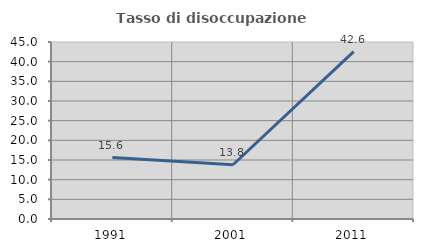
| Category | Tasso di disoccupazione giovanile  |
|---|---|
| 1991.0 | 15.625 |
| 2001.0 | 13.793 |
| 2011.0 | 42.553 |